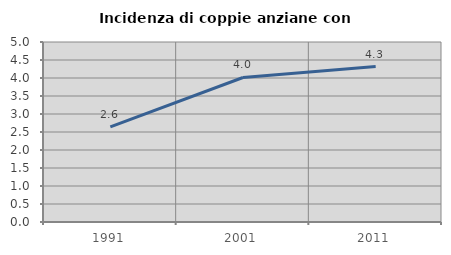
| Category | Incidenza di coppie anziane con figli |
|---|---|
| 1991.0 | 2.642 |
| 2001.0 | 4.015 |
| 2011.0 | 4.319 |